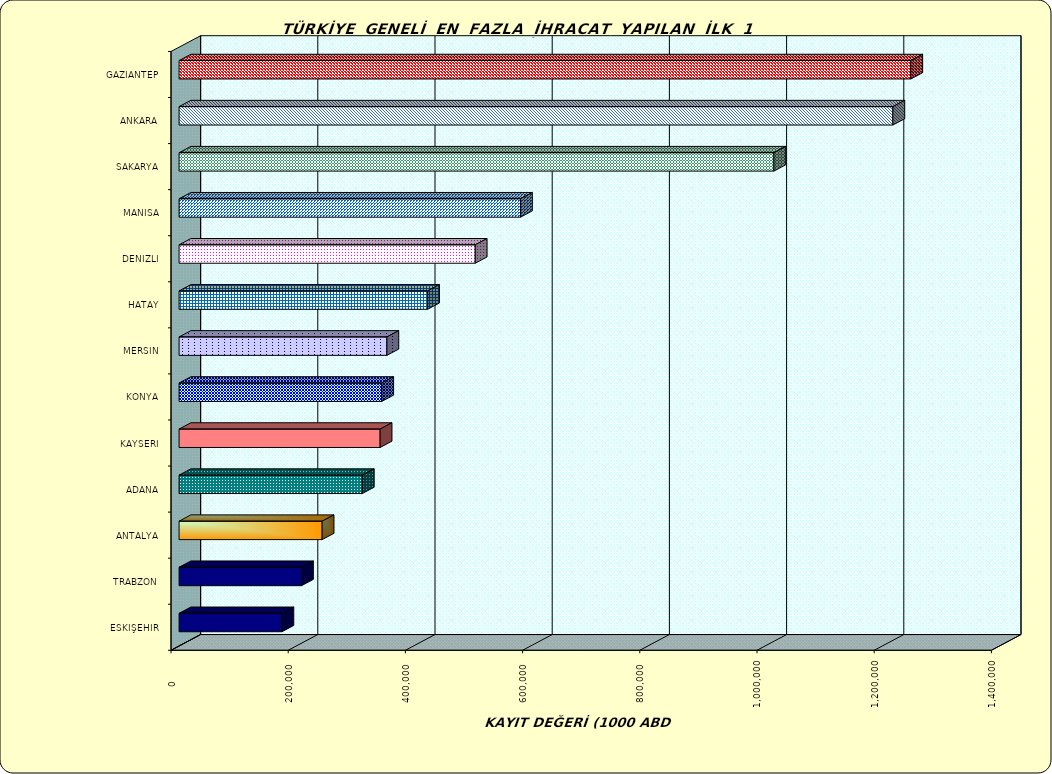
| Category | Series 0 |
|---|---|
| GAZIANTEP | 1248693.428 |
| ANKARA | 1218114.583 |
| SAKARYA | 1015041.193 |
| MANISA | 582669.4 |
| DENIZLI | 505416.181 |
| HATAY | 424100.424 |
| MERSIN | 354682.752 |
| KONYA | 345860.992 |
| KAYSERI | 343086.237 |
| ADANA | 312683.308 |
| ANTALYA | 244123.572 |
| TRABZON | 208938.237 |
| ESKIŞEHIR | 175520.727 |